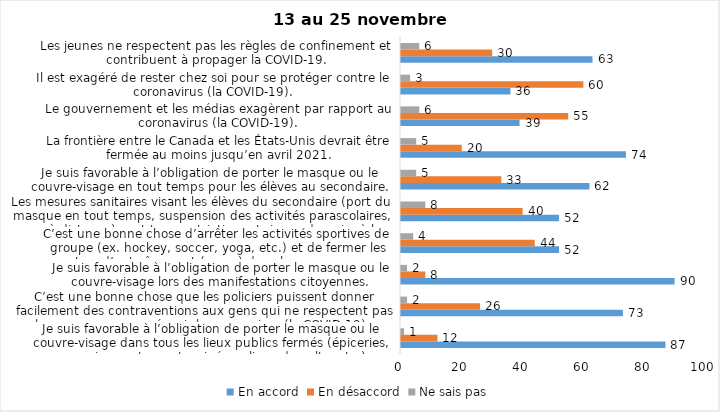
| Category | En accord | En désaccord | Ne sais pas |
|---|---|---|---|
| Je suis favorable à l’obligation de porter le masque ou le couvre-visage dans tous les lieux publics fermés (épiceries, magasins, restaurants, cinéma, lieux de culte, etc.). | 87 | 12 | 1 |
| C’est une bonne chose que les policiers puissent donner facilement des contraventions aux gens qui ne respectent pas les mesures pour prévenir le coronavirus (la COVID-19). | 73 | 26 | 2 |
| Je suis favorable à l’obligation de porter le masque ou le couvre-visage lors des manifestations citoyennes. | 90 | 8 | 2 |
| C’est une bonne chose d’arrêter les activités sportives de groupe (ex. hockey, soccer, yoga, etc.) et de fermer les centres d’entraînement (gyms) dans les zones rouges. | 52 | 44 | 4 |
| Les mesures sanitaires visant les élèves du secondaire (port du masque en tout temps, suspension des activités parascolaires, cours à distance) sont trop restrictives et risque de nuire à leur santé mentale et leur développement. | 52 | 40 | 8 |
| Je suis favorable à l’obligation de porter le masque ou le couvre-visage en tout temps pour les élèves au secondaire. | 62 | 33 | 5 |
| La frontière entre le Canada et les États-Unis devrait être fermée au moins jusqu’en avril 2021. | 74 | 20 | 5 |
| Le gouvernement et les médias exagèrent par rapport au coronavirus (la COVID-19). | 39 | 55 | 6 |
| Il est exagéré de rester chez soi pour se protéger contre le coronavirus (la COVID-19). | 36 | 60 | 3 |
| Les jeunes ne respectent pas les règles de confinement et contribuent à propager la COVID-19. | 63 | 30 | 6 |